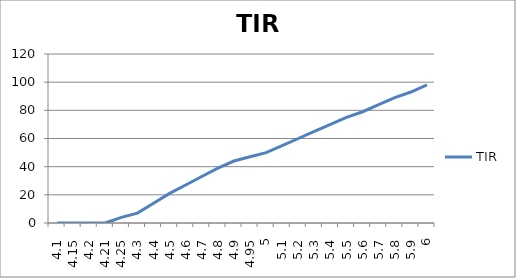
| Category | TIR |
|---|---|
| 4.1 | 0 |
| 4.15 | 0 |
| 4.2 | 0 |
| 4.21 | 0 |
| 4.25 | 4 |
| 4.3 | 7 |
| 4.4 | 14 |
| 4.5 | 21 |
| 4.6 | 27 |
| 4.7 | 33 |
| 4.8 | 39 |
| 4.9 | 44 |
| 4.95 | 47 |
| 5.0 | 50 |
| 5.1 | 55 |
| 5.2 | 60 |
| 5.3 | 65 |
| 5.4 | 70 |
| 5.5 | 75 |
| 5.6 | 79 |
| 5.7 | 84 |
| 5.8 | 89 |
| 5.9 | 93 |
| 6.0 | 98 |